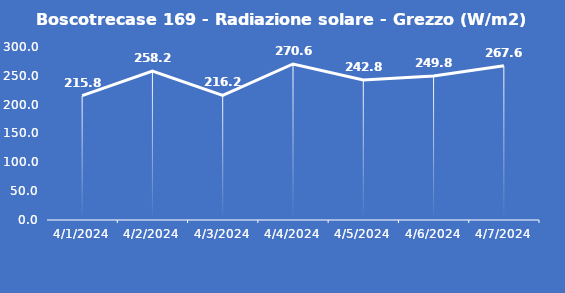
| Category | Boscotrecase 169 - Radiazione solare - Grezzo (W/m2) |
|---|---|
| 4/1/24 | 215.8 |
| 4/2/24 | 258.2 |
| 4/3/24 | 216.2 |
| 4/4/24 | 270.6 |
| 4/5/24 | 242.8 |
| 4/6/24 | 249.8 |
| 4/7/24 | 267.6 |